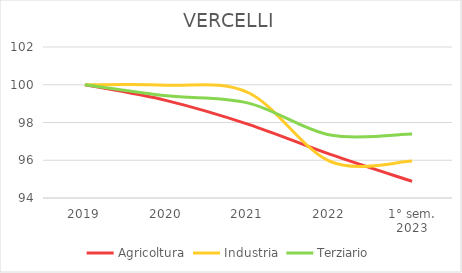
| Category | Agricoltura | Industria | Terziario |
|---|---|---|---|
| 2019 | 100 | 100 | 100 |
| 2020 | 99.161 | 99.979 | 99.414 |
| 2021 | 97.903 | 99.576 | 99.026 |
| 2022 | 96.309 | 95.934 | 97.333 |
| 1° sem.
2023 | 94.883 | 95.955 | 97.39 |